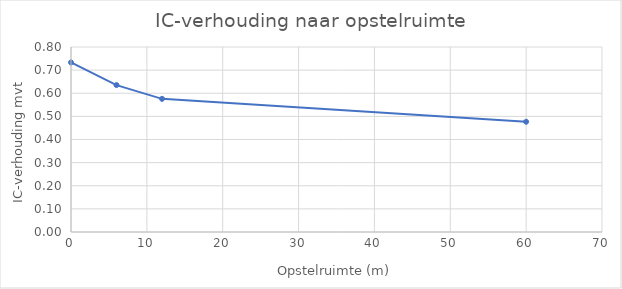
| Category | Series 0 |
|---|---|
| 0.0 | 0.733 |
| 6.0 | 0.635 |
| 12.0 | 0.576 |
| 60.0 | 0.477 |